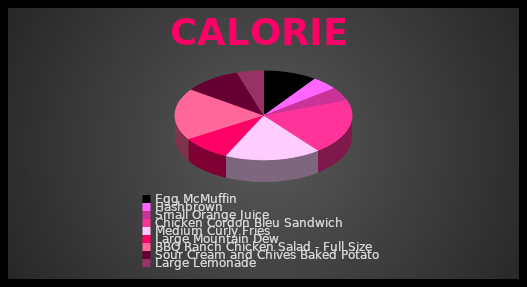
| Category | Calories | Fat Calories |
|---|---|---|
| Egg McMuffin | 300 | 13 |
| Hashbrown | 150 | 9 |
| Small Orange Juice | 150 | 0 |
| Chicken Cordon Bleu Sandwich | 620 | 31 |
| Medium Curly Fries | 540 | 29 |
| Large Mountain Dew | 280 | 0 |
| BBQ Ranch Chicken Salad - Full Size | 580 | 29 |
| Sour Cream and Chives Baked Potato | 320 | 3.5 |
| Large Lemonade | 150 | 0 |